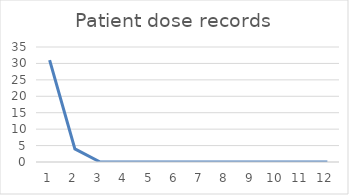
| Category | Patient dose records |
|---|---|
| 0 | 31 |
| 1 | 4 |
| 2 | 0 |
| 3 | 0 |
| 4 | 0 |
| 5 | 0 |
| 6 | 0 |
| 7 | 0 |
| 8 | 0 |
| 9 | 0 |
| 10 | 0 |
| 11 | 0 |